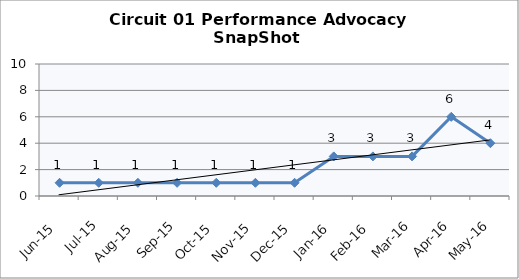
| Category | Circuit 01 |
|---|---|
| Jun-15 | 1 |
| Jul-15 | 1 |
| Aug-15 | 1 |
| Sep-15 | 1 |
| Oct-15 | 1 |
| Nov-15 | 1 |
| Dec-15 | 1 |
| Jan-16 | 3 |
| Feb-16 | 3 |
| Mar-16 | 3 |
| Apr-16 | 6 |
| May-16 | 4 |